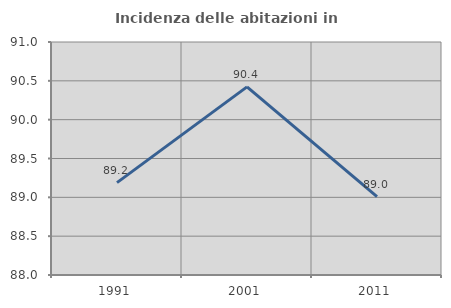
| Category | Incidenza delle abitazioni in proprietà  |
|---|---|
| 1991.0 | 89.189 |
| 2001.0 | 90.423 |
| 2011.0 | 89.008 |